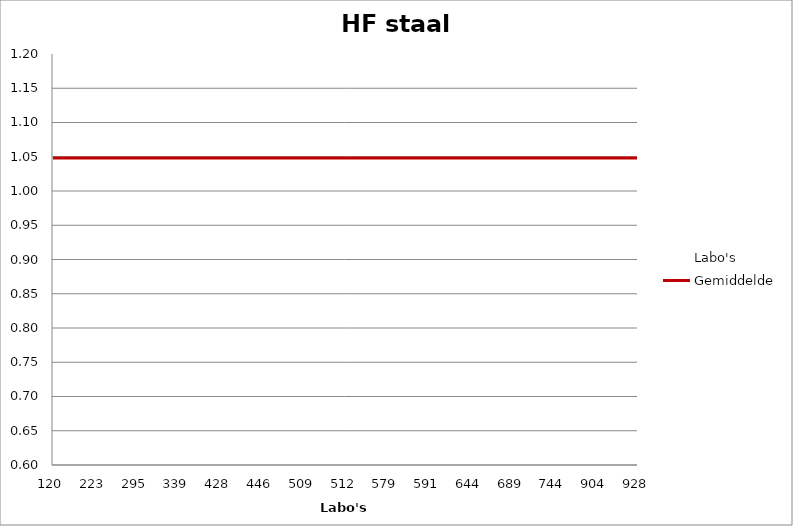
| Category | Labo's | Gemiddelde |
|---|---|---|
| 120.0 | 0.62 | 1.048 |
| 223.0 | 1.1 | 1.048 |
| 295.0 | 1 | 1.048 |
| 339.0 | 1.01 | 1.048 |
| 428.0 | 1.19 | 1.048 |
| 446.0 | 1.11 | 1.048 |
| 509.0 | 1.05 | 1.048 |
| 512.0 | 0.86 | 1.048 |
| 579.0 | 1.04 | 1.048 |
| 591.0 | 1.13 | 1.048 |
| 644.0 | 1.09 | 1.048 |
| 689.0 | 1.07 | 1.048 |
| 744.0 | 1 | 1.048 |
| 904.0 | 1.15 | 1.048 |
| 928.0 | 0.97 | 1.048 |